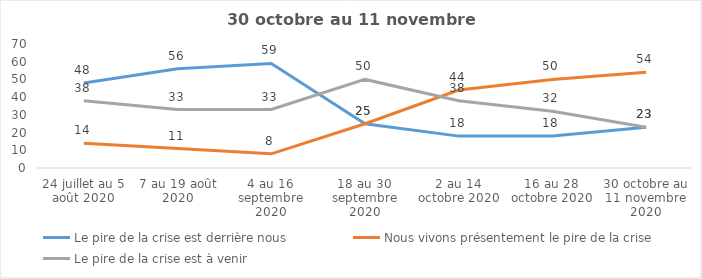
| Category | Le pire de la crise est derrière nous | Nous vivons présentement le pire de la crise | Le pire de la crise est à venir |
|---|---|---|---|
| 24 juillet au 5 août 2020 | 48 | 14 | 38 |
| 7 au 19 août 2020 | 56 | 11 | 33 |
| 4 au 16 septembre 2020 | 59 | 8 | 33 |
| 18 au 30 septembre 2020 | 25 | 25 | 50 |
| 2 au 14 octobre 2020 | 18 | 44 | 38 |
| 16 au 28 octobre 2020 | 18 | 50 | 32 |
| 30 octobre au 11 novembre 2020 | 23 | 54 | 23 |